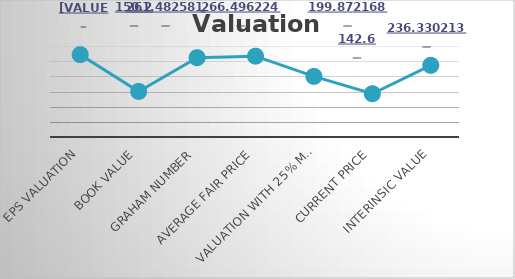
| Category | Series 0 |
|---|---|
| EPS Valuation | 271.51 |
| Book value | 150.25 |
| Graham Number | 261.483 |
| Average Fair Price | 266.496 |
| Valuation with 25% Margin of safety  | 199.872 |
| Current Price | 142.65 |
| Interinsic Value | 236.33 |